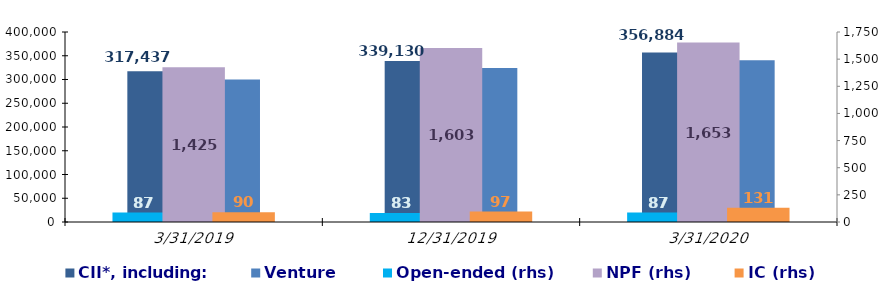
| Category | CII*, including: | Venture |
|---|---|---|
| 3/31/19 | 317437.48 | 300241.73 |
| 12/31/19 | 339129.8 | 324105 |
| 3/31/20 | 356884.27 | 340549.47 |